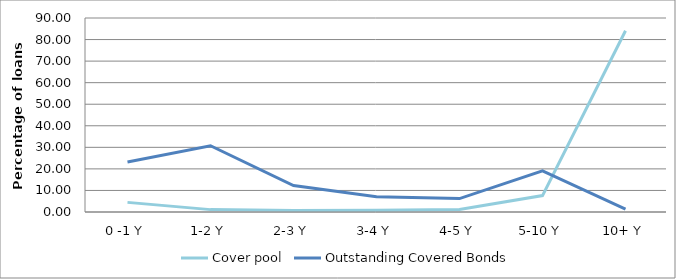
| Category | Cover pool | Outstanding Covered Bonds |
|---|---|---|
| 0 -1 Y | 4.465 | 23.184 |
| 1-2 Y | 1.104 | 30.745 |
| 2-3 Y | 0.754 | 12.298 |
| 3-4 Y | 0.845 | 7.097 |
| 4-5 Y | 1.146 | 6.224 |
| 5-10 Y | 7.62 | 19.085 |
| 10+ Y | 84.066 | 1.366 |